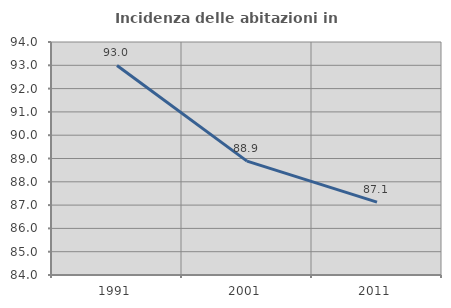
| Category | Incidenza delle abitazioni in proprietà  |
|---|---|
| 1991.0 | 92.994 |
| 2001.0 | 88.889 |
| 2011.0 | 87.126 |